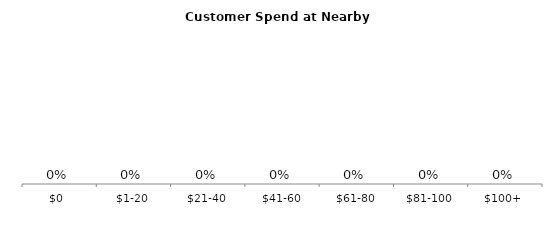
| Category | Series 0 |
|---|---|
| $0 | 0 |
| $1-20 | 0 |
| $21-40 | 0 |
| $41-60 | 0 |
| $61-80 | 0 |
| $81-100 | 0 |
| $100+ | 0 |